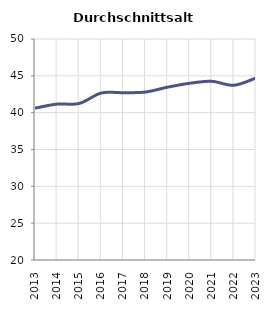
| Category | Durchschnittsalter |
|---|---|
| 2013.0 | 40.61 |
| 2014.0 | 41.164 |
| 2015.0 | 41.246 |
| 2016.0 | 42.669 |
| 2017.0 | 42.71 |
| 2018.0 | 42.8 |
| 2019.0 | 43.46 |
| 2020.0 | 43.99 |
| 2021.0 | 44.253 |
| 2022.0 | 43.72 |
| 2023.0 | 44.707 |